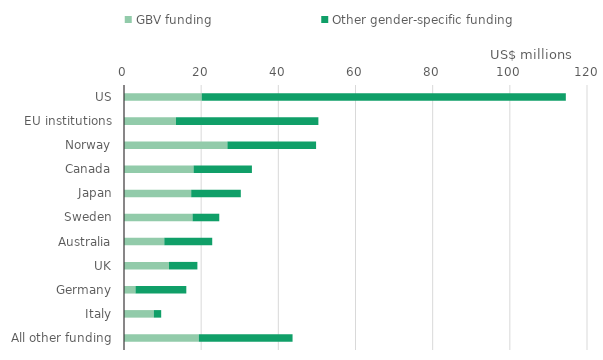
| Category | GBV funding | Other gender-specific funding |
|---|---|---|
| US | 20.142 | 94.372 |
| EU institutions | 13.46 | 36.921 |
| Norway | 26.798 | 22.985 |
| Canada | 18.029 | 15.124 |
| Japan | 17.415 | 12.86 |
| Sweden | 17.763 | 6.93 |
| Australia | 10.445 | 12.42 |
| UK | 11.652 | 7.369 |
| Germany | 2.977 | 13.173 |
| Italy | 7.713 | 1.926 |
| All other funding | 19.385 | 24.302 |